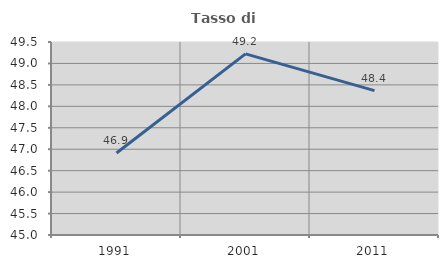
| Category | Tasso di occupazione   |
|---|---|
| 1991.0 | 46.911 |
| 2001.0 | 49.223 |
| 2011.0 | 48.367 |